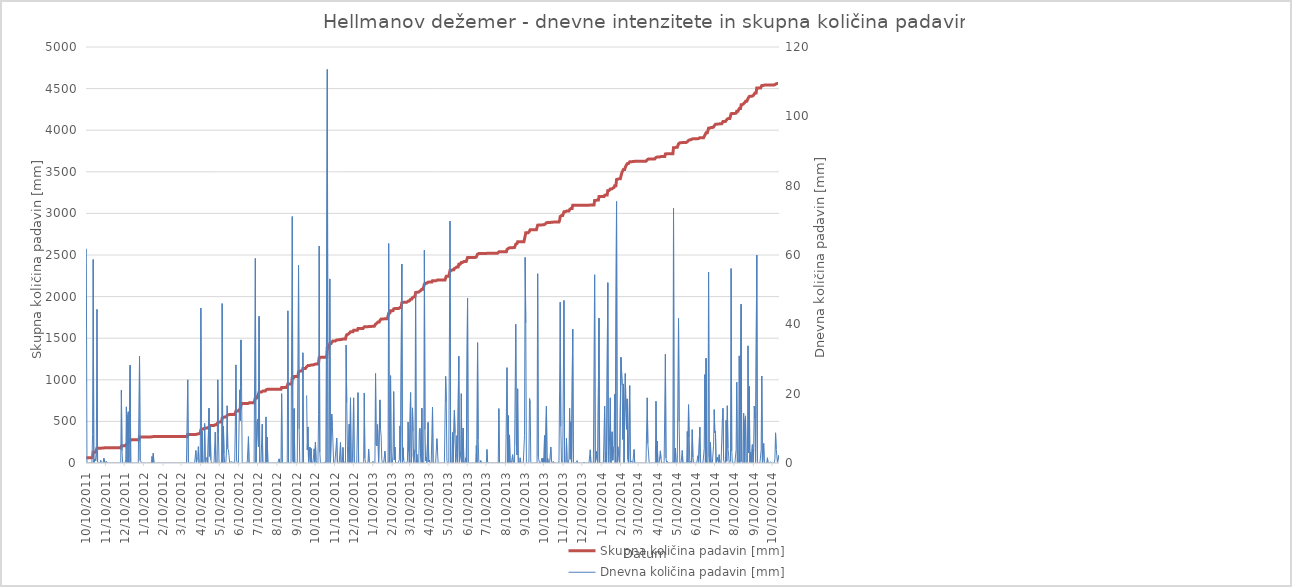
| Category | Skupna količina padavin [mm] |
|---|---|
| 10/10/11 | 61.8 |
| 10/11/11 | 61.8 |
| 10/12/11 | 61.8 |
| 10/13/11 | 61.8 |
| 10/14/11 | 61.8 |
| 10/15/11 | 61.8 |
| 10/16/11 | 61.8 |
| 10/17/11 | 61.8 |
| 10/18/11 | 61.8 |
| 10/19/11 | 61.8 |
| 10/20/11 | 70 |
| 10/21/11 | 128.7 |
| 10/22/11 | 128.7 |
| 10/23/11 | 128.7 |
| 10/24/11 | 129.9 |
| 10/25/11 | 130.5 |
| 10/26/11 | 133.2 |
| 10/27/11 | 177.5 |
| 10/28/11 | 177.75 |
| 10/29/11 | 177.75 |
| 10/30/11 | 177.75 |
| 10/31/11 | 177.75 |
| 11/1/11 | 177.75 |
| 11/2/11 | 178.55 |
| 11/3/11 | 178.85 |
| 11/4/11 | 178.85 |
| 11/5/11 | 178.85 |
| 11/6/11 | 178.85 |
| 11/7/11 | 180.25 |
| 11/8/11 | 181.85 |
| 11/9/11 | 181.85 |
| 11/10/11 | 181.85 |
| 11/11/11 | 182.35 |
| 11/12/11 | 182.35 |
| 11/13/11 | 182.35 |
| 11/14/11 | 182.35 |
| 11/15/11 | 182.35 |
| 11/16/11 | 182.35 |
| 11/17/11 | 182.35 |
| 11/18/11 | 182.35 |
| 11/19/11 | 182.35 |
| 11/20/11 | 182.35 |
| 11/21/11 | 182.35 |
| 11/22/11 | 182.35 |
| 11/23/11 | 182.35 |
| 11/24/11 | 182.35 |
| 11/25/11 | 182.35 |
| 11/26/11 | 182.35 |
| 11/27/11 | 182.35 |
| 11/28/11 | 182.35 |
| 11/29/11 | 182.35 |
| 11/30/11 | 182.35 |
| 12/1/11 | 182.35 |
| 12/2/11 | 182.35 |
| 12/3/11 | 182.35 |
| 12/4/11 | 182.35 |
| 12/5/11 | 203.35 |
| 12/6/11 | 206.75 |
| 12/7/11 | 206.75 |
| 12/8/11 | 206.75 |
| 12/9/11 | 206.75 |
| 12/10/11 | 206.75 |
| 12/11/11 | 206.75 |
| 12/12/11 | 207.75 |
| 12/13/11 | 223.95 |
| 12/14/11 | 223.95 |
| 12/15/11 | 237.75 |
| 12/16/11 | 252.55 |
| 12/17/11 | 252.55 |
| 12/18/11 | 252.55 |
| 12/19/11 | 280.75 |
| 12/20/11 | 280.75 |
| 12/21/11 | 280.75 |
| 12/22/11 | 280.75 |
| 12/23/11 | 280.75 |
| 12/24/11 | 280.75 |
| 12/25/11 | 280.75 |
| 12/26/11 | 280.75 |
| 12/27/11 | 280.75 |
| 12/28/11 | 280.75 |
| 12/29/11 | 280.75 |
| 12/30/11 | 280.75 |
| 12/31/11 | 280.75 |
| 1/1/12 | 280.75 |
| 1/2/12 | 280.75 |
| 1/3/12 | 311.55 |
| 1/4/12 | 312.25 |
| 1/5/12 | 312.75 |
| 1/6/12 | 313 |
| 1/7/12 | 313 |
| 1/8/12 | 313 |
| 1/9/12 | 313 |
| 1/10/12 | 313 |
| 1/11/12 | 313 |
| 1/12/12 | 313 |
| 1/13/12 | 313 |
| 1/14/12 | 313 |
| 1/15/12 | 313 |
| 1/16/12 | 313 |
| 1/17/12 | 313 |
| 1/18/12 | 313 |
| 1/19/12 | 313 |
| 1/20/12 | 313 |
| 1/21/12 | 313 |
| 1/22/12 | 313 |
| 1/23/12 | 314.9 |
| 1/24/12 | 314.9 |
| 1/25/12 | 317.7 |
| 1/26/12 | 317.7 |
| 1/27/12 | 317.7 |
| 1/28/12 | 317.7 |
| 1/29/12 | 317.7 |
| 1/30/12 | 317.7 |
| 1/31/12 | 317.7 |
| 2/1/12 | 317.7 |
| 2/2/12 | 317.7 |
| 2/3/12 | 317.7 |
| 2/4/12 | 317.7 |
| 2/5/12 | 317.7 |
| 2/6/12 | 317.7 |
| 2/7/12 | 317.7 |
| 2/8/12 | 317.7 |
| 2/9/12 | 317.7 |
| 2/10/12 | 317.7 |
| 2/11/12 | 317.7 |
| 2/12/12 | 317.7 |
| 2/13/12 | 317.7 |
| 2/14/12 | 317.7 |
| 2/15/12 | 317.7 |
| 2/16/12 | 317.7 |
| 2/17/12 | 317.7 |
| 2/18/12 | 317.7 |
| 2/19/12 | 317.7 |
| 2/20/12 | 317.7 |
| 2/21/12 | 317.7 |
| 2/22/12 | 317.7 |
| 2/23/12 | 317.7 |
| 2/24/12 | 317.7 |
| 2/25/12 | 317.7 |
| 2/26/12 | 317.7 |
| 2/27/12 | 317.7 |
| 2/28/12 | 317.7 |
| 2/29/12 | 317.7 |
| 3/1/12 | 317.7 |
| 3/2/12 | 317.7 |
| 3/3/12 | 317.7 |
| 3/4/12 | 317.7 |
| 3/5/12 | 317.7 |
| 3/6/12 | 317.7 |
| 3/7/12 | 317.7 |
| 3/8/12 | 317.7 |
| 3/9/12 | 317.7 |
| 3/10/12 | 317.7 |
| 3/11/12 | 317.7 |
| 3/12/12 | 317.7 |
| 3/13/12 | 317.7 |
| 3/14/12 | 317.7 |
| 3/15/12 | 317.7 |
| 3/16/12 | 317.7 |
| 3/17/12 | 317.7 |
| 3/18/12 | 317.7 |
| 3/19/12 | 317.7 |
| 3/20/12 | 341.7 |
| 3/21/12 | 341.7 |
| 3/22/12 | 341.7 |
| 3/23/12 | 341.7 |
| 3/24/12 | 341.7 |
| 3/25/12 | 341.7 |
| 3/26/12 | 341.7 |
| 3/27/12 | 341.7 |
| 3/28/12 | 341.7 |
| 3/29/12 | 341.7 |
| 3/30/12 | 341.7 |
| 3/31/12 | 341.7 |
| 4/1/12 | 341.7 |
| 4/2/12 | 345.3 |
| 4/3/12 | 345.3 |
| 4/4/12 | 346.8 |
| 4/5/12 | 348.6 |
| 4/6/12 | 353.3 |
| 4/7/12 | 353.3 |
| 4/8/12 | 353.3 |
| 4/9/12 | 353.3 |
| 4/10/12 | 398 |
| 4/11/12 | 398 |
| 4/12/12 | 407.2 |
| 4/13/12 | 407.2 |
| 4/14/12 | 407.2 |
| 4/15/12 | 407.2 |
| 4/16/12 | 418.6 |
| 4/17/12 | 419 |
| 4/18/12 | 419 |
| 4/19/12 | 420.4 |
| 4/20/12 | 422.1 |
| 4/21/12 | 422.1 |
| 4/22/12 | 422.1 |
| 4/23/12 | 437.9 |
| 4/24/12 | 439.8 |
| 4/25/12 | 450.4 |
| 4/26/12 | 451.3 |
| 4/27/12 | 451.3 |
| 4/28/12 | 451.3 |
| 4/29/12 | 451.3 |
| 4/30/12 | 451.3 |
| 5/1/12 | 451.3 |
| 5/2/12 | 451.3 |
| 5/3/12 | 460.2 |
| 5/4/12 | 460.2 |
| 5/5/12 | 460.2 |
| 5/6/12 | 460.2 |
| 5/7/12 | 484.2 |
| 5/8/12 | 492.5 |
| 5/9/12 | 492.5 |
| 5/10/12 | 492.5 |
| 5/11/12 | 492.5 |
| 5/12/12 | 492.5 |
| 5/13/12 | 492.5 |
| 5/14/12 | 538.5 |
| 5/15/12 | 538.5 |
| 5/16/12 | 549.1 |
| 5/17/12 | 551.8 |
| 5/18/12 | 551.8 |
| 5/19/12 | 551.8 |
| 5/20/12 | 551.8 |
| 5/21/12 | 556.2 |
| 5/22/12 | 572.7 |
| 5/23/12 | 576.8 |
| 5/24/12 | 580.6 |
| 5/25/12 | 582.7 |
| 5/26/12 | 582.7 |
| 5/27/12 | 582.7 |
| 5/28/12 | 583.1 |
| 5/29/12 | 583.7 |
| 5/30/12 | 583.9 |
| 5/31/12 | 584.1 |
| 6/1/12 | 584.3 |
| 6/2/12 | 584.3 |
| 6/3/12 | 584.3 |
| 6/4/12 | 594.8 |
| 6/5/12 | 623.1 |
| 6/6/12 | 624 |
| 6/7/12 | 624 |
| 6/8/12 | 624 |
| 6/9/12 | 624 |
| 6/10/12 | 624 |
| 6/11/12 | 645.1 |
| 6/12/12 | 657.3 |
| 6/13/12 | 692.8 |
| 6/14/12 | 714.9 |
| 6/15/12 | 714.9 |
| 6/16/12 | 714.9 |
| 6/17/12 | 714.9 |
| 6/18/12 | 714.9 |
| 6/19/12 | 714.9 |
| 6/20/12 | 714.9 |
| 6/21/12 | 714.9 |
| 6/22/12 | 715.1 |
| 6/23/12 | 715.1 |
| 6/24/12 | 715.1 |
| 6/25/12 | 722.7 |
| 6/26/12 | 722.7 |
| 6/27/12 | 722.7 |
| 6/28/12 | 722.7 |
| 6/29/12 | 722.7 |
| 6/30/12 | 722.7 |
| 7/1/12 | 722.7 |
| 7/2/12 | 722.7 |
| 7/3/12 | 722.7 |
| 7/4/12 | 722.7 |
| 7/5/12 | 722.7 |
| 7/6/12 | 781.7 |
| 7/7/12 | 781.7 |
| 7/8/12 | 781.7 |
| 7/9/12 | 793.8 |
| 7/10/12 | 806.5 |
| 7/11/12 | 811.2 |
| 7/12/12 | 853.5 |
| 7/13/12 | 853.6 |
| 7/14/12 | 853.6 |
| 7/15/12 | 853.6 |
| 7/16/12 | 853.6 |
| 7/17/12 | 864.8 |
| 7/18/12 | 864.8 |
| 7/19/12 | 864.8 |
| 7/20/12 | 864.8 |
| 7/21/12 | 864.8 |
| 7/22/12 | 864.8 |
| 7/23/12 | 878.1 |
| 7/24/12 | 878.1 |
| 7/25/12 | 885.6 |
| 7/26/12 | 885.8 |
| 7/27/12 | 885.8 |
| 7/28/12 | 885.8 |
| 7/29/12 | 885.8 |
| 7/30/12 | 885.8 |
| 7/31/12 | 885.8 |
| 8/1/12 | 885.8 |
| 8/2/12 | 885.8 |
| 8/3/12 | 885.8 |
| 8/4/12 | 885.8 |
| 8/5/12 | 885.8 |
| 8/6/12 | 885.8 |
| 8/7/12 | 885.8 |
| 8/8/12 | 885.8 |
| 8/9/12 | 885.8 |
| 8/10/12 | 885.8 |
| 8/11/12 | 885.8 |
| 8/12/12 | 885.8 |
| 8/13/12 | 887 |
| 8/14/12 | 887 |
| 8/15/12 | 887 |
| 8/16/12 | 887 |
| 8/17/12 | 907 |
| 8/18/12 | 907 |
| 8/19/12 | 907 |
| 8/20/12 | 907 |
| 8/21/12 | 907 |
| 8/22/12 | 907 |
| 8/23/12 | 907 |
| 8/24/12 | 907 |
| 8/25/12 | 907 |
| 8/26/12 | 907 |
| 8/27/12 | 950.9 |
| 8/28/12 | 950.9 |
| 8/29/12 | 950.9 |
| 8/30/12 | 950.9 |
| 8/31/12 | 950.9 |
| 9/1/12 | 950.9 |
| 9/2/12 | 950.9 |
| 9/3/12 | 1022 |
| 9/4/12 | 1022.5 |
| 9/5/12 | 1022.5 |
| 9/6/12 | 1038.2 |
| 9/7/12 | 1038.2 |
| 9/8/12 | 1038.2 |
| 9/9/12 | 1038.2 |
| 9/10/12 | 1038.2 |
| 9/11/12 | 1038.2 |
| 9/12/12 | 1038.2 |
| 9/13/12 | 1095.2 |
| 9/14/12 | 1105 |
| 9/15/12 | 1105 |
| 9/16/12 | 1105 |
| 9/17/12 | 1105 |
| 9/18/12 | 1105 |
| 9/19/12 | 1105 |
| 9/20/12 | 1136.8 |
| 9/21/12 | 1136.8 |
| 9/22/12 | 1136.8 |
| 9/23/12 | 1136.8 |
| 9/24/12 | 1136.8 |
| 9/25/12 | 1136.8 |
| 9/26/12 | 1156.3 |
| 9/27/12 | 1160.1 |
| 9/28/12 | 1170.5 |
| 9/29/12 | 1170.5 |
| 9/30/12 | 1170.5 |
| 10/1/12 | 1175.1 |
| 10/2/12 | 1175.1 |
| 10/3/12 | 1179.3 |
| 10/4/12 | 1179.3 |
| 10/5/12 | 1179.3 |
| 10/6/12 | 1179.3 |
| 10/7/12 | 1179.3 |
| 10/8/12 | 1183.4 |
| 10/9/12 | 1183.4 |
| 10/10/12 | 1189.4 |
| 10/11/12 | 1190.2 |
| 10/12/12 | 1190.2 |
| 10/13/12 | 1190.2 |
| 10/14/12 | 1190.2 |
| 10/15/12 | 1204.2 |
| 10/16/12 | 1266.8 |
| 10/17/12 | 1269.9 |
| 10/18/12 | 1269.9 |
| 10/19/12 | 1269.9 |
| 10/20/12 | 1269.9 |
| 10/21/12 | 1269.9 |
| 10/22/12 | 1269.9 |
| 10/23/12 | 1269.9 |
| 10/24/12 | 1269.9 |
| 10/25/12 | 1269.9 |
| 10/26/12 | 1270.3 |
| 10/27/12 | 1270.3 |
| 10/28/12 | 1270.3 |
| 10/29/12 | 1383.8 |
| 10/30/12 | 1383.8 |
| 10/31/12 | 1383.8 |
| 11/1/12 | 1383.8 |
| 11/2/12 | 1436.9 |
| 11/3/12 | 1436.9 |
| 11/4/12 | 1436.9 |
| 11/5/12 | 1451 |
| 11/6/12 | 1461.8 |
| 11/7/12 | 1467.8 |
| 11/8/12 | 1467.8 |
| 11/9/12 | 1467.8 |
| 11/10/12 | 1467.8 |
| 11/11/12 | 1467.8 |
| 11/12/12 | 1472.4 |
| 11/13/12 | 1479.6 |
| 11/14/12 | 1479.9 |
| 11/15/12 | 1479.9 |
| 11/16/12 | 1479.9 |
| 11/17/12 | 1479.9 |
| 11/18/12 | 1479.9 |
| 11/19/12 | 1485.8 |
| 11/20/12 | 1485.8 |
| 11/21/12 | 1485.8 |
| 11/22/12 | 1485.8 |
| 11/23/12 | 1490.3 |
| 11/24/12 | 1490.3 |
| 11/25/12 | 1490.3 |
| 11/26/12 | 1490.6 |
| 11/27/12 | 1490.6 |
| 11/28/12 | 1524.6 |
| 11/29/12 | 1542 |
| 11/30/12 | 1547.1 |
| 12/1/12 | 1547.1 |
| 12/2/12 | 1547.1 |
| 12/3/12 | 1558.3 |
| 12/4/12 | 1558.3 |
| 12/5/12 | 1577.1 |
| 12/6/12 | 1577.1 |
| 12/7/12 | 1577.1 |
| 12/8/12 | 1577.1 |
| 12/9/12 | 1577.1 |
| 12/10/12 | 1595.9 |
| 12/11/12 | 1595.9 |
| 12/12/12 | 1595.9 |
| 12/13/12 | 1595.9 |
| 12/14/12 | 1595.9 |
| 12/15/12 | 1595.9 |
| 12/16/12 | 1595.9 |
| 12/17/12 | 1616.2 |
| 12/18/12 | 1616.2 |
| 12/19/12 | 1616.2 |
| 12/20/12 | 1616.2 |
| 12/21/12 | 1616.2 |
| 12/22/12 | 1616.2 |
| 12/23/12 | 1616.2 |
| 12/24/12 | 1616.2 |
| 12/25/12 | 1616.2 |
| 12/26/12 | 1616.2 |
| 12/27/12 | 1636.4 |
| 12/28/12 | 1637.8 |
| 12/29/12 | 1637.8 |
| 12/30/12 | 1637.8 |
| 12/31/12 | 1637.8 |
| 1/1/13 | 1637.8 |
| 1/2/13 | 1638.1 |
| 1/3/13 | 1642.1 |
| 1/4/13 | 1642.1 |
| 1/5/13 | 1642.1 |
| 1/6/13 | 1642.1 |
| 1/7/13 | 1642.1 |
| 1/8/13 | 1642.1 |
| 1/9/13 | 1642.1 |
| 1/10/13 | 1642.6 |
| 1/11/13 | 1642.6 |
| 1/12/13 | 1642.6 |
| 1/13/13 | 1642.6 |
| 1/14/13 | 1668.4 |
| 1/15/13 | 1673.6 |
| 1/16/13 | 1678.5 |
| 1/17/13 | 1689.6 |
| 1/18/13 | 1694.5 |
| 1/19/13 | 1694.5 |
| 1/20/13 | 1694.5 |
| 1/21/13 | 1712.7 |
| 1/22/13 | 1722.4 |
| 1/23/13 | 1730.1 |
| 1/24/13 | 1731.1 |
| 1/25/13 | 1731.1 |
| 1/26/13 | 1731.1 |
| 1/27/13 | 1731.1 |
| 1/28/13 | 1731.1 |
| 1/29/13 | 1734.5 |
| 1/30/13 | 1734.5 |
| 1/31/13 | 1734.5 |
| 2/1/13 | 1734.5 |
| 2/2/13 | 1734.5 |
| 2/3/13 | 1734.5 |
| 2/4/13 | 1797.8 |
| 2/5/13 | 1797.8 |
| 2/6/13 | 1803.4 |
| 2/7/13 | 1828.6 |
| 2/8/13 | 1828.6 |
| 2/9/13 | 1828.6 |
| 2/10/13 | 1828.6 |
| 2/11/13 | 1831.6 |
| 2/12/13 | 1852.2 |
| 2/13/13 | 1853.1 |
| 2/14/13 | 1857.7 |
| 2/15/13 | 1857.7 |
| 2/16/13 | 1857.7 |
| 2/17/13 | 1857.7 |
| 2/18/13 | 1857.9 |
| 2/19/13 | 1857.9 |
| 2/20/13 | 1857.9 |
| 2/21/13 | 1858.8 |
| 2/22/13 | 1869.5 |
| 2/23/13 | 1869.5 |
| 2/24/13 | 1869.5 |
| 2/25/13 | 1926.9 |
| 2/26/13 | 1927 |
| 2/27/13 | 1931.4 |
| 2/28/13 | 1932.2 |
| 3/1/13 | 1932.2 |
| 3/2/13 | 1932.2 |
| 3/3/13 | 1932.2 |
| 3/4/13 | 1932.2 |
| 3/5/13 | 1932.2 |
| 3/6/13 | 1932.8 |
| 3/7/13 | 1944.6 |
| 3/8/13 | 1947.9 |
| 3/9/13 | 1947.9 |
| 3/10/13 | 1947.9 |
| 3/11/13 | 1968.2 |
| 3/12/13 | 1968.2 |
| 3/13/13 | 1970.7 |
| 3/14/13 | 1986.6 |
| 3/15/13 | 1995.7 |
| 3/16/13 | 1995.7 |
| 3/17/13 | 1995.7 |
| 3/18/13 | 1999.6 |
| 3/19/13 | 2049.1 |
| 3/20/13 | 2049.1 |
| 3/21/13 | 2051.6 |
| 3/22/13 | 2051.6 |
| 3/23/13 | 2051.6 |
| 3/24/13 | 2051.6 |
| 3/25/13 | 2060.8 |
| 3/26/13 | 2070.8 |
| 3/27/13 | 2072.6 |
| 3/28/13 | 2072.6 |
| 3/29/13 | 2088.4 |
| 3/30/13 | 2088.4 |
| 3/31/13 | 2088.4 |
| 4/1/13 | 2088.4 |
| 4/2/13 | 2149.8 |
| 4/3/13 | 2159.4 |
| 4/4/13 | 2160 |
| 4/5/13 | 2161.7 |
| 4/6/13 | 2161.7 |
| 4/7/13 | 2161.7 |
| 4/8/13 | 2173.4 |
| 4/9/13 | 2173.8 |
| 4/10/13 | 2174.6 |
| 4/11/13 | 2174.6 |
| 4/12/13 | 2174.6 |
| 4/13/13 | 2174.6 |
| 4/14/13 | 2174.6 |
| 4/15/13 | 2190.7 |
| 4/16/13 | 2190.7 |
| 4/17/13 | 2190.7 |
| 4/18/13 | 2190.7 |
| 4/19/13 | 2190.7 |
| 4/20/13 | 2190.7 |
| 4/21/13 | 2190.7 |
| 4/22/13 | 2197.7 |
| 4/23/13 | 2201 |
| 4/24/13 | 2201 |
| 4/25/13 | 2201 |
| 4/26/13 | 2201 |
| 4/27/13 | 2201 |
| 4/28/13 | 2201 |
| 4/29/13 | 2201 |
| 4/30/13 | 2201 |
| 5/1/13 | 2201 |
| 5/2/13 | 2201 |
| 5/3/13 | 2201 |
| 5/4/13 | 2201 |
| 5/5/13 | 2201 |
| 5/6/13 | 2226 |
| 5/7/13 | 2243.5 |
| 5/8/13 | 2244.1 |
| 5/9/13 | 2244.1 |
| 5/10/13 | 2244.1 |
| 5/11/13 | 2244.1 |
| 5/12/13 | 2244.1 |
| 5/13/13 | 2313.9 |
| 5/14/13 | 2313.9 |
| 5/15/13 | 2313.9 |
| 5/16/13 | 2313.9 |
| 5/17/13 | 2322.7 |
| 5/18/13 | 2322.7 |
| 5/19/13 | 2322.7 |
| 5/20/13 | 2337.9 |
| 5/21/13 | 2346.6 |
| 5/22/13 | 2346.6 |
| 5/23/13 | 2349.1 |
| 5/24/13 | 2357 |
| 5/25/13 | 2357 |
| 5/26/13 | 2357 |
| 5/27/13 | 2387.8 |
| 5/28/13 | 2387.8 |
| 5/29/13 | 2387.8 |
| 5/30/13 | 2391.1 |
| 5/31/13 | 2411.1 |
| 6/1/13 | 2411.1 |
| 6/2/13 | 2411.1 |
| 6/3/13 | 2421.2 |
| 6/4/13 | 2421.2 |
| 6/5/13 | 2421.2 |
| 6/6/13 | 2421.5 |
| 6/7/13 | 2423 |
| 6/8/13 | 2423 |
| 6/9/13 | 2423 |
| 6/10/13 | 2470.5 |
| 6/11/13 | 2470.5 |
| 6/12/13 | 2470.7 |
| 6/13/13 | 2470.7 |
| 6/14/13 | 2470.7 |
| 6/15/13 | 2470.7 |
| 6/16/13 | 2470.7 |
| 6/17/13 | 2470.7 |
| 6/18/13 | 2470.7 |
| 6/19/13 | 2470.7 |
| 6/20/13 | 2470.7 |
| 6/21/13 | 2470.7 |
| 6/22/13 | 2470.7 |
| 6/23/13 | 2470.7 |
| 6/24/13 | 2475.7 |
| 6/25/13 | 2475.7 |
| 6/26/13 | 2510.4 |
| 6/27/13 | 2517.2 |
| 6/28/13 | 2517.2 |
| 6/29/13 | 2517.2 |
| 6/30/13 | 2517.2 |
| 7/1/13 | 2517.9 |
| 7/2/13 | 2517.9 |
| 7/3/13 | 2517.9 |
| 7/4/13 | 2517.9 |
| 7/5/13 | 2517.9 |
| 7/6/13 | 2517.9 |
| 7/7/13 | 2517.9 |
| 7/8/13 | 2517.9 |
| 7/9/13 | 2517.9 |
| 7/10/13 | 2517.9 |
| 7/11/13 | 2521.8 |
| 7/12/13 | 2522.1 |
| 7/13/13 | 2522.1 |
| 7/14/13 | 2522.1 |
| 7/15/13 | 2522.1 |
| 7/16/13 | 2522.1 |
| 7/17/13 | 2522.1 |
| 7/18/13 | 2522.1 |
| 7/19/13 | 2522.1 |
| 7/20/13 | 2522.1 |
| 7/21/13 | 2522.1 |
| 7/22/13 | 2522.1 |
| 7/23/13 | 2522.1 |
| 7/24/13 | 2522.1 |
| 7/25/13 | 2522.1 |
| 7/26/13 | 2522.1 |
| 7/27/13 | 2522.1 |
| 7/28/13 | 2522.1 |
| 7/29/13 | 2522.1 |
| 7/30/13 | 2537.8 |
| 7/31/13 | 2537.8 |
| 8/1/13 | 2537.8 |
| 8/2/13 | 2537.8 |
| 8/3/13 | 2537.8 |
| 8/4/13 | 2537.8 |
| 8/5/13 | 2537.8 |
| 8/6/13 | 2537.8 |
| 8/7/13 | 2537.8 |
| 8/8/13 | 2537.8 |
| 8/9/13 | 2537.8 |
| 8/10/13 | 2537.8 |
| 8/11/13 | 2537.8 |
| 8/12/13 | 2565.3 |
| 8/13/13 | 2565.3 |
| 8/14/13 | 2579 |
| 8/15/13 | 2579 |
| 8/16/13 | 2587.1 |
| 8/17/13 | 2587.1 |
| 8/18/13 | 2587.1 |
| 8/19/13 | 2587.1 |
| 8/20/13 | 2587.1 |
| 8/21/13 | 2589.5 |
| 8/22/13 | 2589.5 |
| 8/23/13 | 2589.5 |
| 8/24/13 | 2589.5 |
| 8/25/13 | 2589.5 |
| 8/26/13 | 2629.5 |
| 8/27/13 | 2634.8 |
| 8/28/13 | 2637.1 |
| 8/29/13 | 2658.5 |
| 8/30/13 | 2658.5 |
| 8/31/13 | 2658.5 |
| 9/1/13 | 2658.5 |
| 9/2/13 | 2660 |
| 9/3/13 | 2660.1 |
| 9/4/13 | 2660.1 |
| 9/5/13 | 2660.1 |
| 9/6/13 | 2660.1 |
| 9/7/13 | 2660.1 |
| 9/8/13 | 2660.1 |
| 9/9/13 | 2668 |
| 9/10/13 | 2727.3 |
| 9/11/13 | 2767.7 |
| 9/12/13 | 2767.7 |
| 9/13/13 | 2767.9 |
| 9/14/13 | 2767.9 |
| 9/15/13 | 2767.9 |
| 9/16/13 | 2768.2 |
| 9/17/13 | 2786.8 |
| 9/18/13 | 2804.1 |
| 9/19/13 | 2804.1 |
| 9/20/13 | 2804.1 |
| 9/21/13 | 2804.1 |
| 9/22/13 | 2804.1 |
| 9/23/13 | 2804.1 |
| 9/24/13 | 2804.1 |
| 9/25/13 | 2804.1 |
| 9/26/13 | 2804.1 |
| 9/27/13 | 2804.1 |
| 9/28/13 | 2804.1 |
| 9/29/13 | 2804.1 |
| 9/30/13 | 2858.7 |
| 10/1/13 | 2860.5 |
| 10/2/13 | 2861.3 |
| 10/3/13 | 2861.3 |
| 10/4/13 | 2861.3 |
| 10/5/13 | 2861.3 |
| 10/6/13 | 2861.3 |
| 10/7/13 | 2862.7 |
| 10/8/13 | 2862.8 |
| 10/9/13 | 2864.2 |
| 10/10/13 | 2864.2 |
| 10/11/13 | 2872.1 |
| 10/12/13 | 2872.1 |
| 10/13/13 | 2872.1 |
| 10/14/13 | 2888.5 |
| 10/15/13 | 2888.5 |
| 10/16/13 | 2889.8 |
| 10/17/13 | 2889.8 |
| 10/18/13 | 2889.8 |
| 10/19/13 | 2889.8 |
| 10/20/13 | 2889.8 |
| 10/21/13 | 2894.4 |
| 10/22/13 | 2894.9 |
| 10/23/13 | 2894.9 |
| 10/24/13 | 2894.9 |
| 10/25/13 | 2895.4 |
| 10/26/13 | 2895.4 |
| 10/27/13 | 2895.4 |
| 10/28/13 | 2895.4 |
| 10/29/13 | 2895.4 |
| 10/30/13 | 2895.4 |
| 10/31/13 | 2895.4 |
| 11/1/13 | 2895.4 |
| 11/2/13 | 2895.4 |
| 11/3/13 | 2895.4 |
| 11/4/13 | 2916.4 |
| 11/5/13 | 2962.8 |
| 11/6/13 | 2973.3 |
| 11/7/13 | 2973.5 |
| 11/8/13 | 2973.9 |
| 11/9/13 | 2973.9 |
| 11/10/13 | 2973.9 |
| 11/11/13 | 3020.8 |
| 11/12/13 | 3020.8 |
| 11/13/13 | 3020.9 |
| 11/14/13 | 3021.2 |
| 11/15/13 | 3028.4 |
| 11/16/13 | 3028.4 |
| 11/17/13 | 3028.4 |
| 11/18/13 | 3028.4 |
| 11/19/13 | 3029.6 |
| 11/20/13 | 3045.4 |
| 11/21/13 | 3046.5 |
| 11/22/13 | 3058.4 |
| 11/23/13 | 3058.4 |
| 11/24/13 | 3058.4 |
| 11/25/13 | 3097 |
| 11/26/13 | 3097 |
| 11/27/13 | 3097 |
| 11/28/13 | 3097 |
| 11/29/13 | 3097 |
| 11/30/13 | 3097 |
| 12/1/13 | 3097 |
| 12/2/13 | 3097.7 |
| 12/3/13 | 3097.7 |
| 12/4/13 | 3097.7 |
| 12/5/13 | 3097.7 |
| 12/6/13 | 3097.7 |
| 12/7/13 | 3097.7 |
| 12/8/13 | 3097.7 |
| 12/9/13 | 3097.7 |
| 12/10/13 | 3097.7 |
| 12/11/13 | 3097.7 |
| 12/12/13 | 3097.7 |
| 12/13/13 | 3097.9 |
| 12/14/13 | 3097.9 |
| 12/15/13 | 3097.9 |
| 12/16/13 | 3097.9 |
| 12/17/13 | 3097.9 |
| 12/18/13 | 3098.1 |
| 12/19/13 | 3098.1 |
| 12/20/13 | 3098.1 |
| 12/21/13 | 3098.1 |
| 12/22/13 | 3098.1 |
| 12/23/13 | 3101.9 |
| 12/24/13 | 3101.9 |
| 12/25/13 | 3101.9 |
| 12/26/13 | 3101.9 |
| 12/27/13 | 3101.9 |
| 12/28/13 | 3101.9 |
| 12/29/13 | 3101.9 |
| 12/30/13 | 3156.2 |
| 12/31/13 | 3156.2 |
| 1/1/14 | 3156.2 |
| 1/2/14 | 3159.5 |
| 1/3/14 | 3160.4 |
| 1/4/14 | 3160.4 |
| 1/5/14 | 3160.4 |
| 1/6/14 | 3202.2 |
| 1/7/14 | 3202.2 |
| 1/8/14 | 3202.2 |
| 1/9/14 | 3202.2 |
| 1/10/14 | 3202.2 |
| 1/11/14 | 3202.2 |
| 1/12/14 | 3202.2 |
| 1/13/14 | 3202.2 |
| 1/14/14 | 3202.2 |
| 1/15/14 | 3218.6 |
| 1/16/14 | 3218.8 |
| 1/17/14 | 3221.8 |
| 1/18/14 | 3221.8 |
| 1/19/14 | 3221.8 |
| 1/20/14 | 3273.8 |
| 1/21/14 | 3274.1 |
| 1/22/14 | 3274.1 |
| 1/23/14 | 3274.1 |
| 1/24/14 | 3292.9 |
| 1/25/14 | 3292.9 |
| 1/26/14 | 3292.9 |
| 1/27/14 | 3301.9 |
| 1/28/14 | 3302.7 |
| 1/29/14 | 3306.9 |
| 1/30/14 | 3311.9 |
| 1/31/14 | 3331.7 |
| 2/1/14 | 3331.7 |
| 2/2/14 | 3331.7 |
| 2/3/14 | 3407.1 |
| 2/4/14 | 3407.1 |
| 2/5/14 | 3411.8 |
| 2/6/14 | 3414.7 |
| 2/7/14 | 3415.3 |
| 2/8/14 | 3415.3 |
| 2/9/14 | 3415.3 |
| 2/10/14 | 3445.8 |
| 2/11/14 | 3476.4 |
| 2/12/14 | 3498.9 |
| 2/13/14 | 3505.7 |
| 2/14/14 | 3528.5 |
| 2/15/14 | 3528.5 |
| 2/16/14 | 3528.5 |
| 2/17/14 | 3554.3 |
| 2/18/14 | 3569.5 |
| 2/19/14 | 3579.2 |
| 2/20/14 | 3597.7 |
| 2/21/14 | 3598.7 |
| 2/22/14 | 3598.7 |
| 2/23/14 | 3598.7 |
| 2/24/14 | 3621 |
| 2/25/14 | 3621 |
| 2/26/14 | 3621 |
| 2/27/14 | 3621.6 |
| 2/28/14 | 3622.3 |
| 3/1/14 | 3622.3 |
| 3/2/14 | 3622.3 |
| 3/3/14 | 3626.2 |
| 3/4/14 | 3626.2 |
| 3/5/14 | 3626.2 |
| 3/6/14 | 3626.2 |
| 3/7/14 | 3626.2 |
| 3/8/14 | 3626.2 |
| 3/9/14 | 3626.2 |
| 3/10/14 | 3626.2 |
| 3/11/14 | 3626.2 |
| 3/12/14 | 3626.2 |
| 3/13/14 | 3626.2 |
| 3/14/14 | 3626.2 |
| 3/15/14 | 3626.2 |
| 3/16/14 | 3626.2 |
| 3/17/14 | 3626.2 |
| 3/18/14 | 3626.2 |
| 3/19/14 | 3626.2 |
| 3/20/14 | 3626.2 |
| 3/21/14 | 3626.2 |
| 3/22/14 | 3626.2 |
| 3/23/14 | 3626.2 |
| 3/24/14 | 3645 |
| 3/25/14 | 3650.6 |
| 3/26/14 | 3653.8 |
| 3/27/14 | 3654 |
| 3/28/14 | 3654.4 |
| 3/29/14 | 3654.4 |
| 3/30/14 | 3654.4 |
| 3/31/14 | 3654.4 |
| 4/1/14 | 3654.4 |
| 4/2/14 | 3654.4 |
| 4/3/14 | 3654.4 |
| 4/4/14 | 3654.4 |
| 4/5/14 | 3654.4 |
| 4/6/14 | 3654.4 |
| 4/7/14 | 3672.2 |
| 4/8/14 | 3672.2 |
| 4/9/14 | 3678.5 |
| 4/10/14 | 3678.5 |
| 4/11/14 | 3678.5 |
| 4/12/14 | 3678.5 |
| 4/13/14 | 3678.5 |
| 4/14/14 | 3682 |
| 4/15/14 | 3683.2 |
| 4/16/14 | 3683.2 |
| 4/17/14 | 3683.2 |
| 4/18/14 | 3683.2 |
| 4/19/14 | 3683.2 |
| 4/20/14 | 3683.2 |
| 4/21/14 | 3683.2 |
| 4/22/14 | 3714.6 |
| 4/23/14 | 3716 |
| 4/24/14 | 3716.2 |
| 4/25/14 | 3716.7 |
| 4/26/14 | 3716.7 |
| 4/27/14 | 3716.7 |
| 4/28/14 | 3716.7 |
| 4/29/14 | 3716.7 |
| 4/30/14 | 3716.7 |
| 5/1/14 | 3716.7 |
| 5/2/14 | 3716.7 |
| 5/3/14 | 3716.7 |
| 5/4/14 | 3716.7 |
| 5/5/14 | 3790.2 |
| 5/6/14 | 3790.2 |
| 5/7/14 | 3790.2 |
| 5/8/14 | 3794.5 |
| 5/9/14 | 3794.5 |
| 5/10/14 | 3794.5 |
| 5/11/14 | 3794.5 |
| 5/12/14 | 3794.5 |
| 5/13/14 | 3836.2 |
| 5/14/14 | 3848.1 |
| 5/15/14 | 3848.1 |
| 5/16/14 | 3848.1 |
| 5/17/14 | 3848.1 |
| 5/18/14 | 3848.1 |
| 5/19/14 | 3851.7 |
| 5/20/14 | 3851.7 |
| 5/21/14 | 3851.7 |
| 5/22/14 | 3851.7 |
| 5/23/14 | 3851.7 |
| 5/24/14 | 3851.7 |
| 5/25/14 | 3851.7 |
| 5/26/14 | 3851.7 |
| 5/27/14 | 3860.8 |
| 5/28/14 | 3860.8 |
| 5/29/14 | 3877.6 |
| 5/30/14 | 3885.1 |
| 5/31/14 | 3885.1 |
| 6/1/14 | 3885.1 |
| 6/2/14 | 3885.7 |
| 6/3/14 | 3885.7 |
| 6/4/14 | 3895.3 |
| 6/5/14 | 3897 |
| 6/6/14 | 3897.3 |
| 6/7/14 | 3897.3 |
| 6/8/14 | 3897.3 |
| 6/9/14 | 3897.3 |
| 6/10/14 | 3897.3 |
| 6/11/14 | 3897.3 |
| 6/12/14 | 3897.3 |
| 6/13/14 | 3899.4 |
| 6/14/14 | 3899.4 |
| 6/15/14 | 3899.4 |
| 6/16/14 | 3909.7 |
| 6/17/14 | 3909.7 |
| 6/18/14 | 3909.7 |
| 6/19/14 | 3909.7 |
| 6/20/14 | 3909.7 |
| 6/21/14 | 3909.7 |
| 6/22/14 | 3909.7 |
| 6/23/14 | 3913.8 |
| 6/24/14 | 3939.3 |
| 6/25/14 | 3939.3 |
| 6/26/14 | 3969.5 |
| 6/27/14 | 3969.5 |
| 6/28/14 | 3969.5 |
| 6/29/14 | 3969.5 |
| 6/30/14 | 4024.6 |
| 7/1/14 | 4026.4 |
| 7/2/14 | 4026.4 |
| 7/3/14 | 4032.3 |
| 7/4/14 | 4032.3 |
| 7/5/14 | 4032.3 |
| 7/6/14 | 4032.3 |
| 7/7/14 | 4032.3 |
| 7/8/14 | 4037.4 |
| 7/9/14 | 4052.8 |
| 7/10/14 | 4061.5 |
| 7/11/14 | 4070.7 |
| 7/12/14 | 4070.7 |
| 7/13/14 | 4070.7 |
| 7/14/14 | 4072.4 |
| 7/15/14 | 4074 |
| 7/16/14 | 4074 |
| 7/17/14 | 4076.4 |
| 7/18/14 | 4076.5 |
| 7/19/14 | 4076.5 |
| 7/20/14 | 4076.5 |
| 7/21/14 | 4076.5 |
| 7/22/14 | 4088.9 |
| 7/23/14 | 4104.7 |
| 7/24/14 | 4105.6 |
| 7/25/14 | 4105.7 |
| 7/26/14 | 4105.7 |
| 7/27/14 | 4105.7 |
| 7/28/14 | 4118 |
| 7/29/14 | 4118.5 |
| 7/30/14 | 4135 |
| 7/31/14 | 4139.2 |
| 8/1/14 | 4141.5 |
| 8/2/14 | 4141.5 |
| 8/3/14 | 4141.5 |
| 8/4/14 | 4141.9 |
| 8/5/14 | 4198 |
| 8/6/14 | 4201.5 |
| 8/7/14 | 4201.5 |
| 8/8/14 | 4201.5 |
| 8/9/14 | 4201.5 |
| 8/10/14 | 4201.5 |
| 8/11/14 | 4201.5 |
| 8/12/14 | 4201.5 |
| 8/13/14 | 4205.3 |
| 8/14/14 | 4228.6 |
| 8/15/14 | 4228.6 |
| 8/16/14 | 4228.6 |
| 8/17/14 | 4228.6 |
| 8/18/14 | 4259.5 |
| 8/19/14 | 4259.5 |
| 8/20/14 | 4259.5 |
| 8/21/14 | 4305.3 |
| 8/22/14 | 4305.7 |
| 8/23/14 | 4306.1 |
| 8/24/14 | 4306.1 |
| 8/25/14 | 4320.5 |
| 8/26/14 | 4320.5 |
| 8/27/14 | 4332.9 |
| 8/28/14 | 4346.5 |
| 8/29/14 | 4346.5 |
| 8/30/14 | 4346.5 |
| 8/31/14 | 4346.5 |
| 9/1/14 | 4380.3 |
| 9/2/14 | 4383.3 |
| 9/3/14 | 4405.4 |
| 9/4/14 | 4405.6 |
| 9/5/14 | 4408.7 |
| 9/6/14 | 4408.7 |
| 9/7/14 | 4408.7 |
| 9/8/14 | 4414 |
| 9/9/14 | 4414 |
| 9/10/14 | 4418.1 |
| 9/11/14 | 4434.5 |
| 9/12/14 | 4447.3 |
| 9/13/14 | 4447.3 |
| 9/14/14 | 4447.3 |
| 9/15/14 | 4507.3 |
| 9/16/14 | 4507.3 |
| 9/17/14 | 4507.3 |
| 9/18/14 | 4507.3 |
| 9/19/14 | 4507.3 |
| 9/20/14 | 4507.3 |
| 9/21/14 | 4507.3 |
| 9/22/14 | 4511.1 |
| 9/23/14 | 4536.2 |
| 9/24/14 | 4536.2 |
| 9/25/14 | 4536.2 |
| 9/26/14 | 4541.8 |
| 9/27/14 | 4541.8 |
| 9/28/14 | 4541.8 |
| 9/29/14 | 4541.8 |
| 9/30/14 | 4541.8 |
| 10/1/14 | 4541.8 |
| 10/2/14 | 4543.3 |
| 10/3/14 | 4543.3 |
| 10/4/14 | 4543.3 |
| 10/5/14 | 4543.3 |
| 10/6/14 | 4543.3 |
| 10/7/14 | 4543.6 |
| 10/8/14 | 4543.8 |
| 10/9/14 | 4543.8 |
| 10/10/14 | 4543.8 |
| 10/11/14 | 4543.8 |
| 10/12/14 | 4543.8 |
| 10/13/14 | 4543.8 |
| 10/14/14 | 4545 |
| 10/15/14 | 4553.7 |
| 10/16/14 | 4557.7 |
| 10/17/14 | 4560 |
| 10/18/14 | 4560 |
| 10/19/14 | 4560 |
| 10/20/14 | 4562.2 |